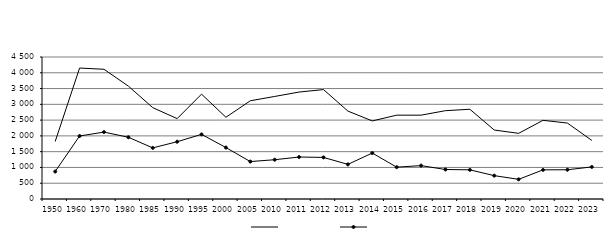
| Category | Series 1 | Series 3 |
|---|---|---|
| 1950.0 | 1822.558 | 870.292 |
| 1960.0 | 4150.159 | 1996.889 |
| 1970.0 | 4110.957 | 2120.244 |
| 1980.0 | 3577.067 | 1956.616 |
| 1985.0 | 2894.777 | 1619.272 |
| 1990.0 | 2547.432 | 1815.279 |
| 1995.0 | 3322.71 | 2047.987 |
| 2000.0 | 2590.289 | 1629.856 |
| 2005.0 | 3112.894 | 1186.048 |
| 2010.0 | 3250 | 1245 |
| 2011.0 | 3389 | 1330 |
| 2012.0 | 3468 | 1318 |
| 2013.0 | 2786 | 1097 |
| 2014.0 | 2474 | 1456 |
| 2015.0 | 2657 | 1009 |
| 2016.0 | 2657 | 1058 |
| 2017.0 | 2799 | 935 |
| 2018.0 | 2844 | 924 |
| 2019.0 | 2186 | 740 |
| 2020.0 | 2081 | 623 |
| 2021.0 | 2493 | 923 |
| 2022.0 | 2406 | 927 |
| 2023.0 | 1857 | 1016 |